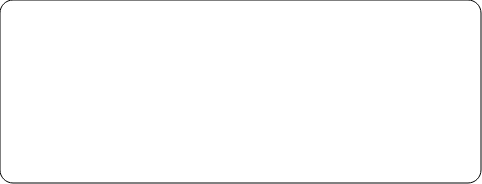
| Category | Series 0 |
|---|---|
| DA (YES) (JA) | 0 |
| NE (NO) (NEIN) | 0 |